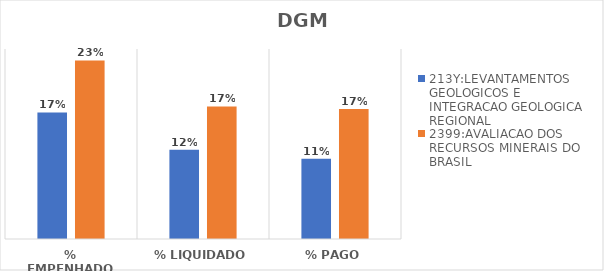
| Category | 213Y:LEVANTAMENTOS GEOLOGICOS E INTEGRACAO GEOLOGICA REGIONAL | 2399:AVALIACAO DOS RECURSOS MINERAIS DO BRASIL |
|---|---|---|
| % EMPENHADO | 0.167 | 0.235 |
| % LIQUIDADO | 0.117 | 0.174 |
| % PAGO | 0.106 | 0.171 |